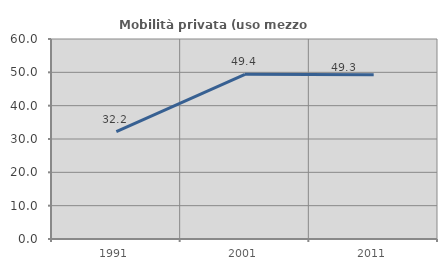
| Category | Mobilità privata (uso mezzo privato) |
|---|---|
| 1991.0 | 32.216 |
| 2001.0 | 49.412 |
| 2011.0 | 49.254 |